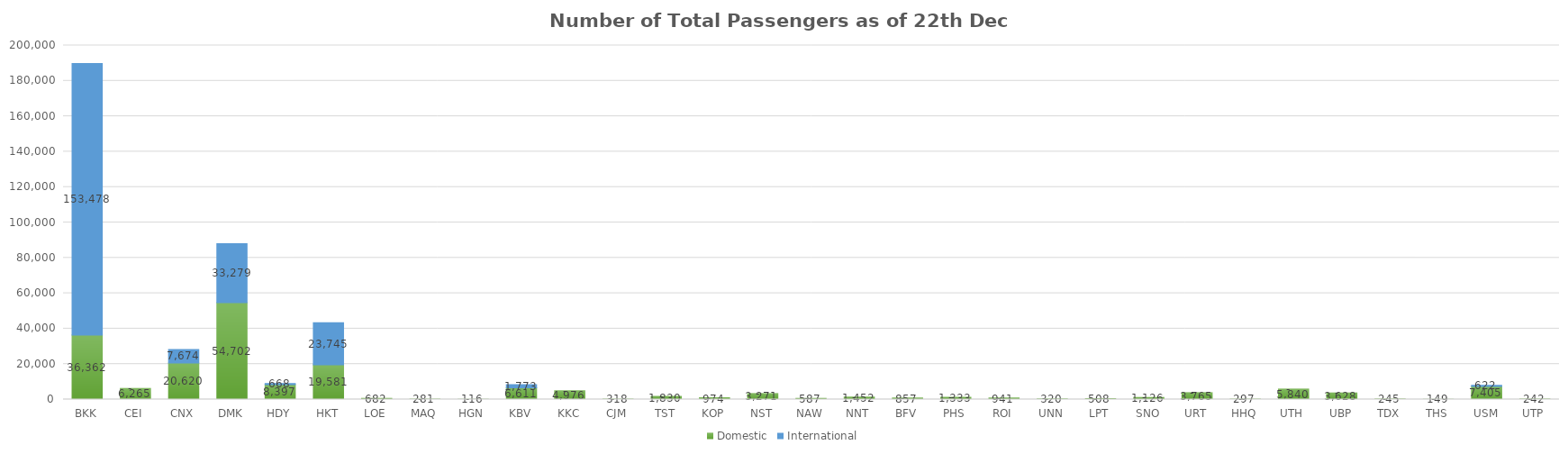
| Category | Domestic | International |
|---|---|---|
| BKK | 36362 | 153478 |
| CEI | 6265 | 0 |
| CNX | 20620 | 7674 |
| DMK | 54702 | 33279 |
| HDY | 8397 | 668 |
| HKT | 19581 | 23745 |
| LOE | 682 | 0 |
| MAQ | 281 | 0 |
| HGN | 116 | 0 |
| KBV | 6611 | 1773 |
| KKC | 4976 | 0 |
| CJM | 318 | 0 |
| TST | 1830 | 0 |
| KOP | 974 | 0 |
| NST | 3271 | 0 |
| NAW | 587 | 0 |
| NNT | 1452 | 0 |
| BFV | 857 | 0 |
| PHS | 1333 | 0 |
| ROI | 941 | 0 |
| UNN | 320 | 0 |
| LPT | 508 | 0 |
| SNO | 1126 | 0 |
| URT | 3765 | 0 |
| HHQ | 297 | 0 |
| UTH | 5840 | 0 |
| UBP | 3628 | 0 |
| TDX | 245 | 0 |
| THS | 149 | 0 |
| USM | 7405 | 622 |
| UTP | 242 | 0 |